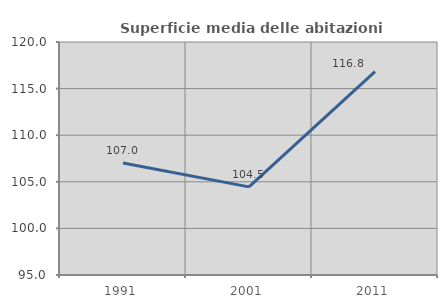
| Category | Superficie media delle abitazioni occupate |
|---|---|
| 1991.0 | 107.027 |
| 2001.0 | 104.457 |
| 2011.0 | 116.815 |